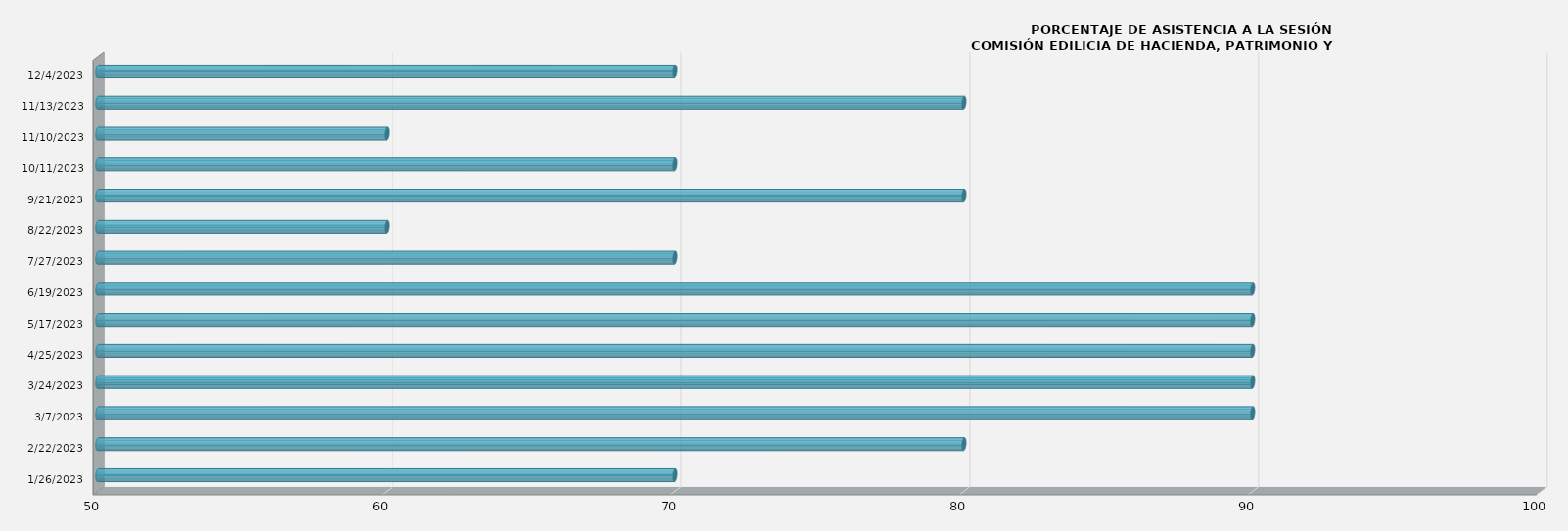
| Category | Series 0 |
|---|---|
| 1/26/23 | 70 |
| 2/22/23 | 80 |
| 3/7/23 | 90 |
| 3/24/23 | 90 |
| 4/25/23 | 90 |
| 5/17/23 | 90 |
| 6/19/23 | 90 |
| 7/27/23 | 70 |
| 8/22/23 | 60 |
| 9/21/23 | 80 |
| 10/11/23 | 70 |
| 11/10/23 | 60 |
| 11/13/23 | 80 |
| 12/4/23 | 70 |